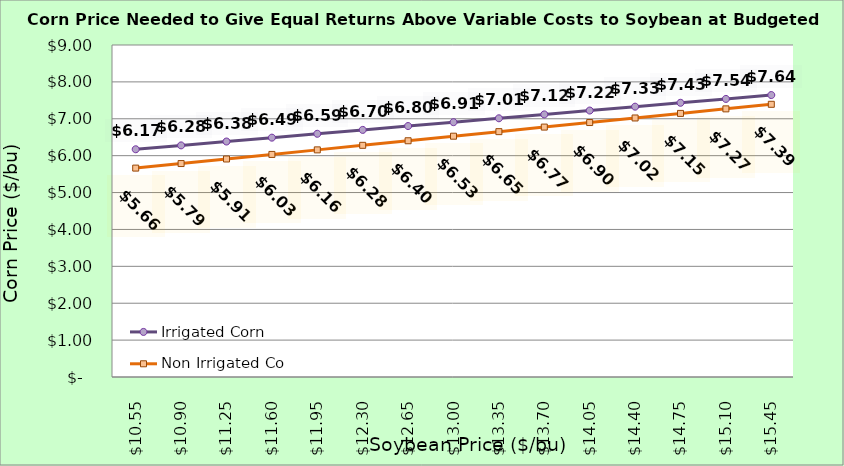
| Category | Irrigated Corn | Non Irrigated Corn |
|---|---|---|
| 10.550000000000002 | 6.173 | 5.663 |
| 10.900000000000002 | 6.278 | 5.786 |
| 11.250000000000002 | 6.383 | 5.91 |
| 11.600000000000001 | 6.488 | 6.034 |
| 11.950000000000001 | 6.593 | 6.157 |
| 12.3 | 6.698 | 6.281 |
| 12.65 | 6.803 | 6.404 |
| 13.0 | 6.908 | 6.528 |
| 13.35 | 7.013 | 6.651 |
| 13.7 | 7.118 | 6.775 |
| 14.049999999999999 | 7.223 | 6.898 |
| 14.399999999999999 | 7.328 | 7.022 |
| 14.749999999999998 | 7.433 | 7.145 |
| 15.099999999999998 | 7.538 | 7.269 |
| 15.449999999999998 | 7.643 | 7.392 |